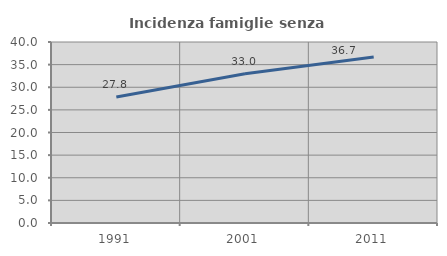
| Category | Incidenza famiglie senza nuclei |
|---|---|
| 1991.0 | 27.848 |
| 2001.0 | 32.99 |
| 2011.0 | 36.673 |